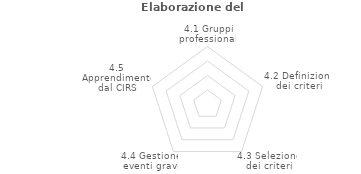
| Category | Series 2 |
|---|---|
| 4.1 Gruppi professionali | 0 |
| 4.2 Definizione dei criteri | 0 |
| 4.3 Selezione dei criteri | 0 |
| 4.4 Gestione eventi gravi | 0 |
| 4.5 Apprendimento dal CIRS | 0 |